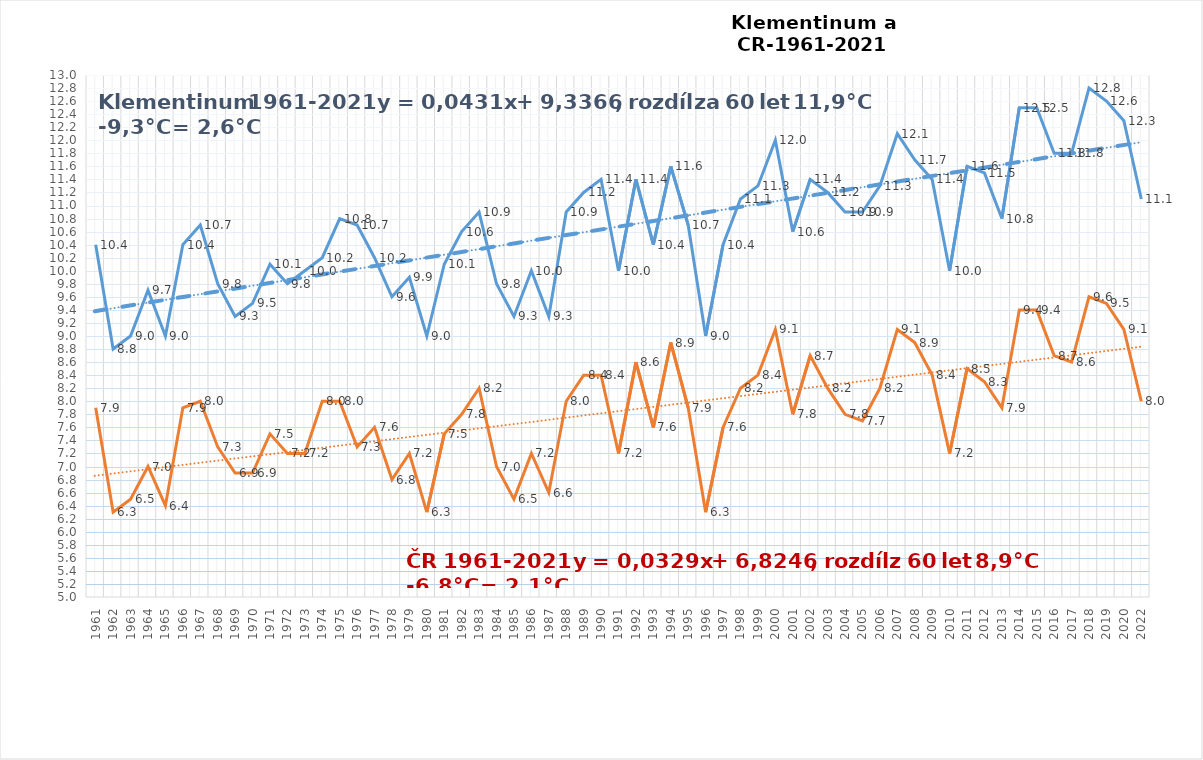
| Category | Klementinum [°C] | ČR roční teplota [°C] |
|---|---|---|
| 1961 | 10.4 | 7.9 |
| 1962 | 8.8 | 6.3 |
| 1963 | 9 | 6.5 |
| 1964 | 9.7 | 7 |
| 1965 | 9 | 6.4 |
| 1966 | 10.4 | 7.9 |
| 1967 | 10.7 | 8 |
| 1968 | 9.8 | 7.3 |
| 1969 | 9.3 | 6.9 |
| 1970 | 9.5 | 6.9 |
| 1971 | 10.1 | 7.5 |
| 1972 | 9.8 | 7.2 |
| 1973 | 10 | 7.2 |
| 1974 | 10.2 | 8 |
| 1975 | 10.8 | 8 |
| 1976 | 10.7 | 7.3 |
| 1977 | 10.2 | 7.6 |
| 1978 | 9.6 | 6.8 |
| 1979 | 9.9 | 7.2 |
| 1980 | 9 | 6.3 |
| 1981 | 10.1 | 7.5 |
| 1982 | 10.6 | 7.8 |
| 1983 | 10.9 | 8.2 |
| 1984 | 9.8 | 7 |
| 1985 | 9.3 | 6.5 |
| 1986 | 10 | 7.2 |
| 1987 | 9.3 | 6.6 |
| 1988 | 10.9 | 8 |
| 1989 | 11.2 | 8.4 |
| 1990 | 11.4 | 8.4 |
| 1991 | 10 | 7.2 |
| 1992 | 11.4 | 8.6 |
| 1993 | 10.4 | 7.6 |
| 1994 | 11.6 | 8.9 |
| 1995 | 10.7 | 7.9 |
| 1996 | 9 | 6.3 |
| 1997 | 10.4 | 7.6 |
| 1998 | 11.1 | 8.2 |
| 1999 | 11.3 | 8.4 |
| 2000 | 12 | 9.1 |
| 2001 | 10.6 | 7.8 |
| 2002 | 11.4 | 8.7 |
| 2003 | 11.2 | 8.2 |
| 2004 | 10.9 | 7.8 |
| 2005 | 10.9 | 7.7 |
| 2006 | 11.3 | 8.2 |
| 2007 | 12.1 | 9.1 |
| 2008 | 11.7 | 8.9 |
| 2009 | 11.4 | 8.4 |
| 2010 | 10 | 7.2 |
| 2011 | 11.6 | 8.5 |
| 2012 | 11.5 | 8.3 |
| 2013 | 10.8 | 7.9 |
| 2014 | 12.5 | 9.4 |
| 2015 | 12.5 | 9.4 |
| 2016 | 11.8 | 8.7 |
| 2017 | 11.8 | 8.6 |
| 2018 | 12.8 | 9.6 |
| 2019 | 12.6 | 9.5 |
| 2020 | 12.3 | 9.1 |
| 2022 | 11.1 | 8 |